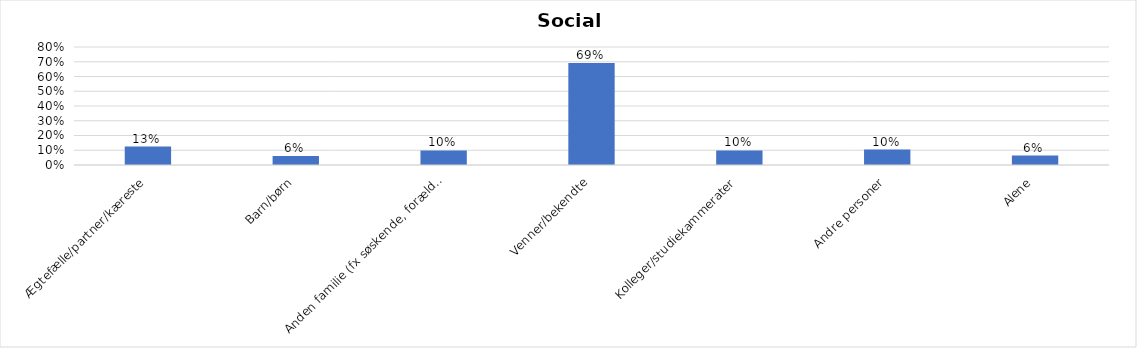
| Category | % |
|---|---|
| Ægtefælle/partner/kæreste | 0.125 |
| Barn/børn | 0.061 |
| Anden familie (fx søskende, forældre) | 0.099 |
| Venner/bekendte | 0.691 |
| Kolleger/studiekammerater | 0.099 |
| Andre personer | 0.105 |
| Alene | 0.064 |